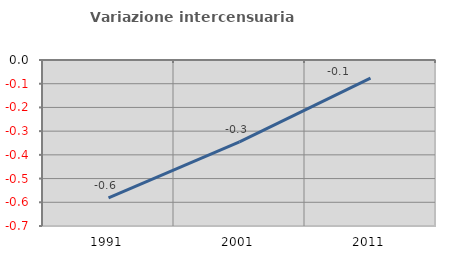
| Category | Variazione intercensuaria annua |
|---|---|
| 1991.0 | -0.581 |
| 2001.0 | -0.346 |
| 2011.0 | -0.076 |